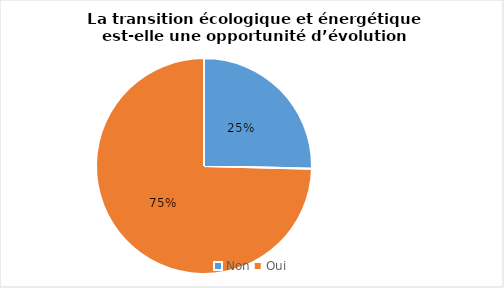
| Category | Series 0 |
|---|---|
| Non  | 0.254 |
| Oui  | 0.746 |